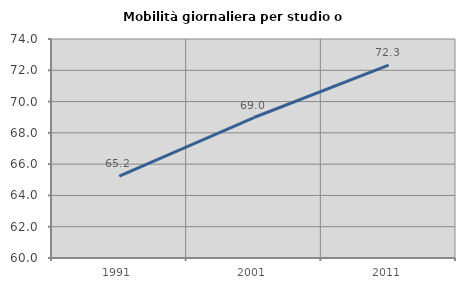
| Category | Mobilità giornaliera per studio o lavoro |
|---|---|
| 1991.0 | 65.239 |
| 2001.0 | 68.981 |
| 2011.0 | 72.328 |